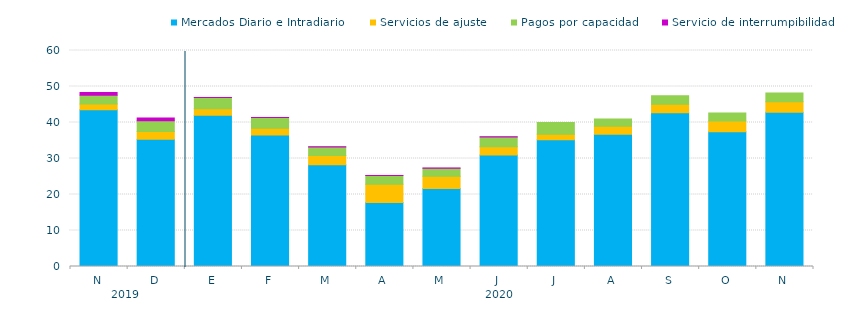
| Category | Mercados Diario e Intradiario  | Servicios de ajuste | Pagos por capacidad | Servicio de interrumpibilidad |
|---|---|---|---|---|
| N | 43.57 | 1.55 | 2.44 | 0.75 |
| D | 35.37 | 2.11 | 3.02 | 0.74 |
| E | 42.04 | 1.79 | 3.11 | 0.03 |
| F | 36.51 | 1.88 | 2.98 | 0.03 |
| M | 28.27 | 2.55 | 2.39 | 0.03 |
| A | 17.79 | 5.05 | 2.41 | 0.04 |
| M | 21.69 | 3.37 | 2.24 | 0.04 |
| J | 30.99 | 2.24 | 2.76 | 0.04 |
| J | 35.19 | 1.58 | 3.22 | 0 |
| A | 36.74 | 2.19 | 2.07 | 0 |
| S | 42.73 | 2.32 | 2.35 | 0 |
| O | 37.45 | 2.94 | 2.26 | 0 |
| N | 42.86 | 2.89 | 2.43 | 0 |